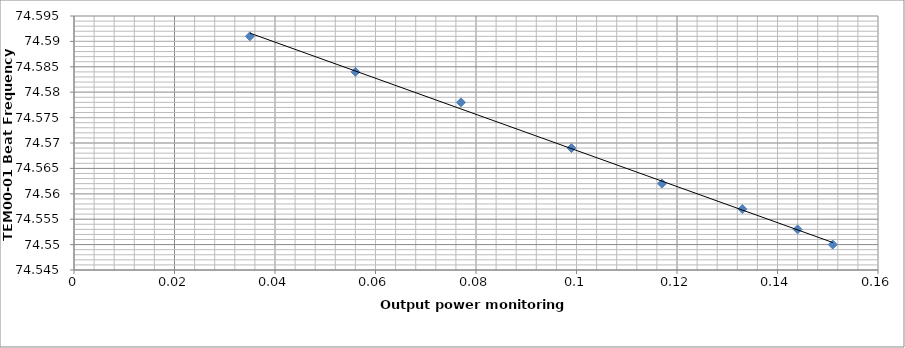
| Category | Series 0 |
|---|---|
| 0.151 | 74.55 |
| 0.144 | 74.553 |
| 0.133 | 74.557 |
| 0.117 | 74.562 |
| 0.099 | 74.569 |
| 0.077 | 74.578 |
| 0.056 | 74.584 |
| 0.035 | 74.591 |